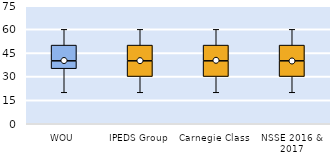
| Category | 25th | 50th | 75th |
|---|---|---|---|
| WOU | 35 | 5 | 10 |
| IPEDS Group | 30 | 10 | 10 |
| Carnegie Class | 30 | 10 | 10 |
| NSSE 2016 & 2017 | 30 | 10 | 10 |